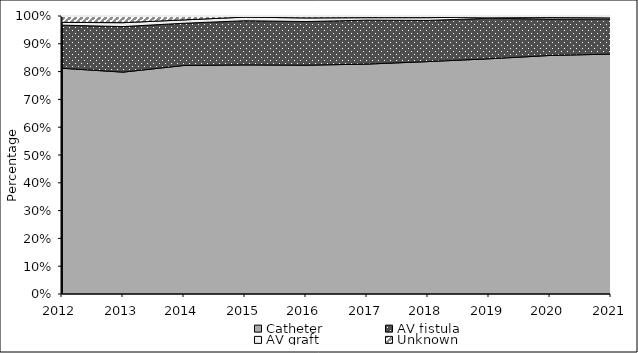
| Category | Catheter | AV fistula | AV graft | Unknown |
|---|---|---|---|---|
| 2012.0 | 81.2 | 15.5 | 1 | 2.3 |
| 2013.0 | 79.8 | 16.4 | 1.4 | 2.4 |
| 2014.0 | 82.2 | 15.2 | 1.2 | 1.4 |
| 2015.0 | 82.4 | 15.9 | 1.3 | 0.4 |
| 2016.0 | 82.3 | 15.7 | 1.3 | 0.6 |
| 2017.0 | 82.7 | 15.8 | 0.9 | 0.6 |
| 2018.0 | 83.6 | 14.8 | 1 | 0.5 |
| 2019.0 | 84.6 | 14.6 | 0.5 | 0.3 |
| 2020.0 | 85.8 | 13.1 | 0.6 | 0.5 |
| 2021.0 | 86.3 | 12.7 | 0.7 | 0.3 |